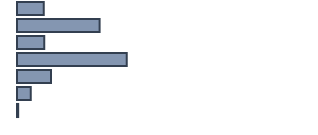
| Category | Series 0 |
|---|---|
| 0 | 9.1 |
| 1 | 28 |
| 2 | 9.2 |
| 3 | 37.2 |
| 4 | 11.5 |
| 5 | 4.7 |
| 6 | 0.4 |